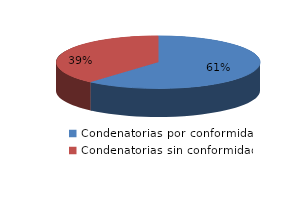
| Category | Series 0 |
|---|---|
| 0 | 51 |
| 1 | 32 |